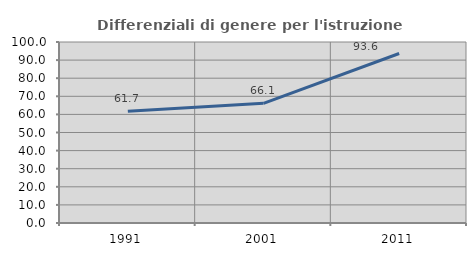
| Category | Differenziali di genere per l'istruzione superiore |
|---|---|
| 1991.0 | 61.711 |
| 2001.0 | 66.134 |
| 2011.0 | 93.647 |